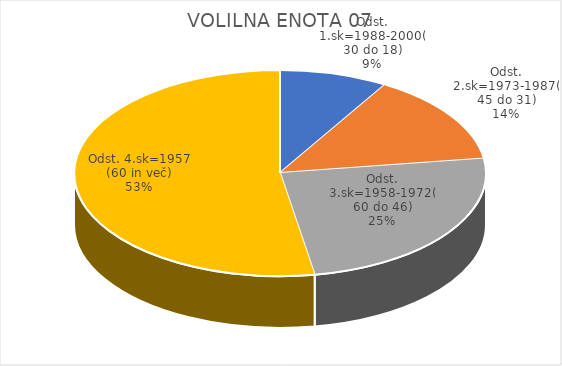
| Category | VOLILNA ENOTA 07 |
|---|---|
| Odst. 1.sk=1988-2000(30 do 18) | 1.11 |
| Odst. 2.sk=1973-1987(45 do 31) | 1.85 |
| Odst. 3.sk=1958-1972(60 do 46) | 3.2 |
| Odst. 4.sk=1957 (60 in več) | 6.86 |